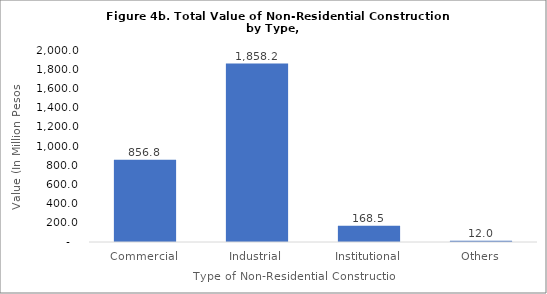
| Category |  856.8  |
|---|---|
| Commercial | 856.755 |
| Industrial | 1858.232 |
| Institutional | 168.543 |
| Others | 12.016 |